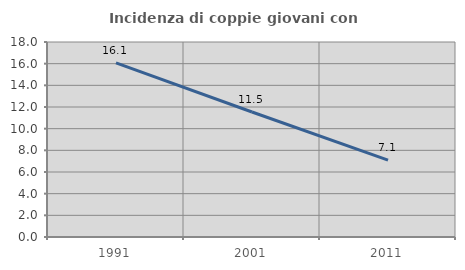
| Category | Incidenza di coppie giovani con figli |
|---|---|
| 1991.0 | 16.078 |
| 2001.0 | 11.538 |
| 2011.0 | 7.099 |